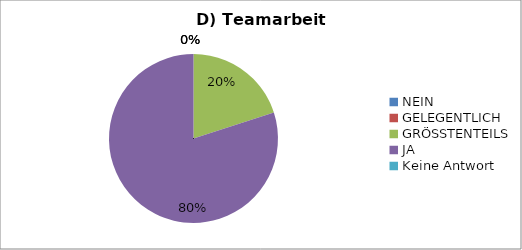
| Category | Series 0 |
|---|---|
| NEIN | 0 |
| GELEGENTLICH | 0 |
| GRÖSSTENTEILS | 5 |
| JA | 20 |
| Keine Antwort | 0 |